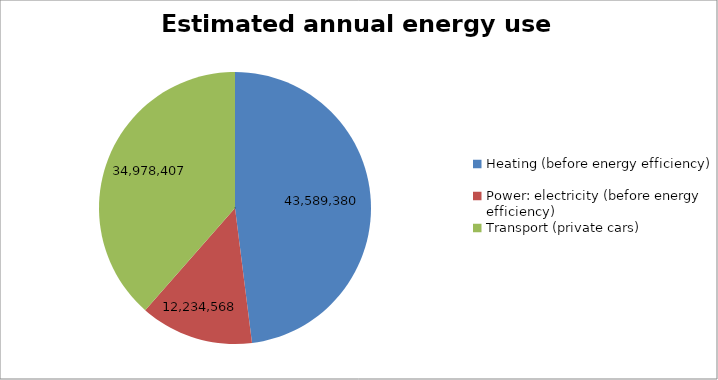
| Category | Estimated annual energy use (kWh/yr) |
|---|---|
| Heating (before energy efficiency) | 43589379.757 |
| Power: electricity (before energy efficiency) | 12234567.725 |
| Transport (private cars) | 34978406.672 |